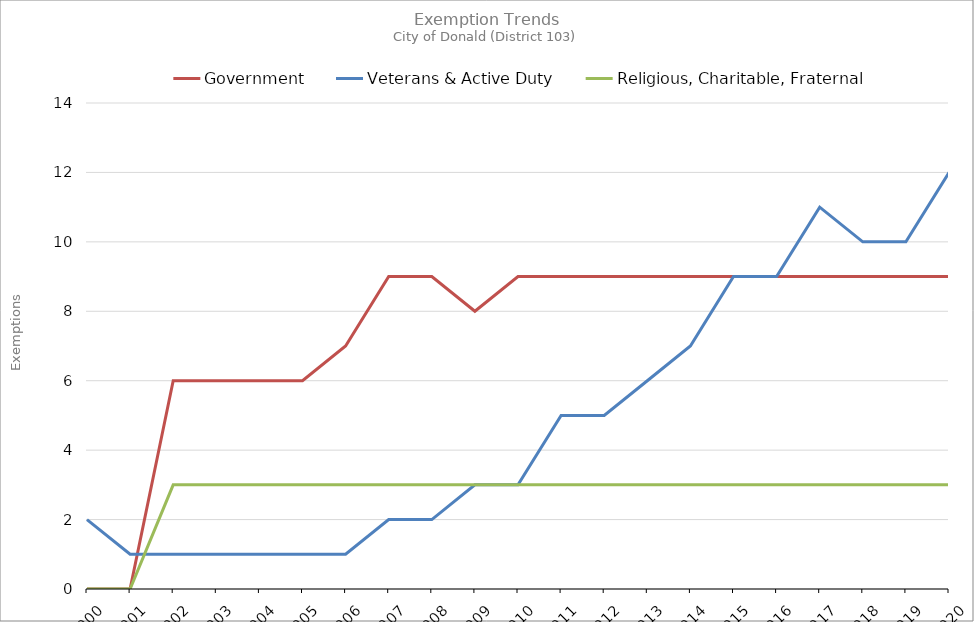
| Category | Government | Veterans & Active Duty | Religious, Charitable, Fraternal |
|---|---|---|---|
| 2000.0 | 0 | 2 | 0 |
| 2001.0 | 0 | 1 | 0 |
| 2002.0 | 6 | 1 | 3 |
| 2003.0 | 6 | 1 | 3 |
| 2004.0 | 6 | 1 | 3 |
| 2005.0 | 6 | 1 | 3 |
| 2006.0 | 7 | 1 | 3 |
| 2007.0 | 9 | 2 | 3 |
| 2008.0 | 9 | 2 | 3 |
| 2009.0 | 8 | 3 | 3 |
| 2010.0 | 9 | 3 | 3 |
| 2011.0 | 9 | 5 | 3 |
| 2012.0 | 9 | 5 | 3 |
| 2013.0 | 9 | 6 | 3 |
| 2014.0 | 9 | 7 | 3 |
| 2015.0 | 9 | 9 | 3 |
| 2016.0 | 9 | 9 | 3 |
| 2017.0 | 9 | 11 | 3 |
| 2018.0 | 9 | 10 | 3 |
| 2019.0 | 9 | 10 | 3 |
| 2020.0 | 9 | 12 | 3 |